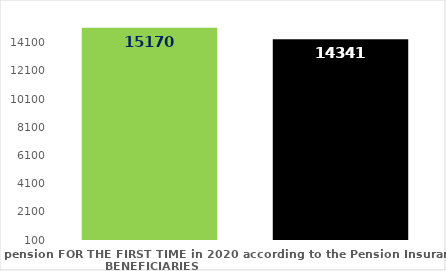
| Category | broj korisnika |
|---|---|
| Pension beneficiaries entitled to pension FOR THE FIRST TIME in 2020 according to the Pension Insurance Act  - NEW BENEFICIARIES | 15170 |
| Pension beneficiaries whose pension entitlement ceased in 2020  -  death caused,   
and who were retired according to the Pension Insurance Act   | 14341 |